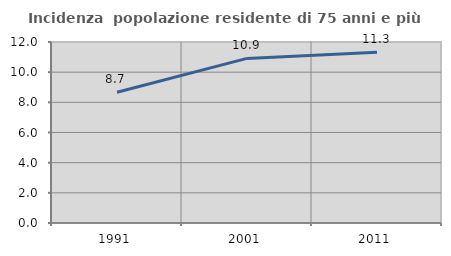
| Category | Incidenza  popolazione residente di 75 anni e più |
|---|---|
| 1991.0 | 8.666 |
| 2001.0 | 10.912 |
| 2011.0 | 11.321 |